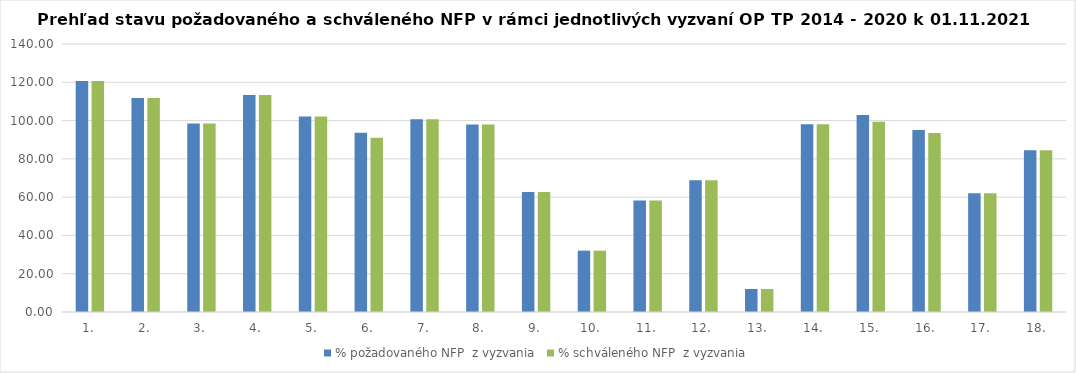
| Category | % požadovaného NFP  z vyzvania | % schváleného NFP  z vyzvania |
|---|---|---|
| 1. | 120.662 | 120.662 |
| 2. | 111.83 | 111.83 |
| 3. | 98.465 | 98.465 |
| 4. | 113.295 | 113.295 |
| 5. | 102.19 | 102.19 |
| 6. | 93.673 | 91.016 |
| 7. | 100.637 | 100.637 |
| 8. | 97.989 | 97.989 |
| 9. | 62.721 | 62.721 |
| 10. | 32.038 | 32.038 |
| 11. | 58.283 | 58.283 |
| 12. | 68.88 | 68.88 |
| 13. | 12.008 | 12.008 |
| 14. | 98.03 | 98.03 |
| 15. | 102.964 | 99.345 |
| 16. | 95.126 | 93.51 |
| 17. | 61.969 | 61.969 |
| 18. | 84.514 | 84.514 |